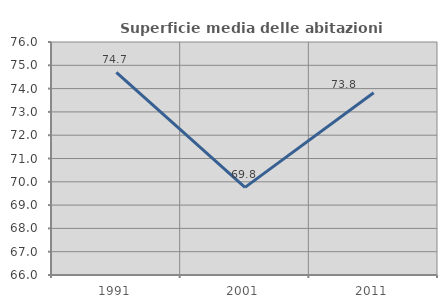
| Category | Superficie media delle abitazioni occupate |
|---|---|
| 1991.0 | 74.699 |
| 2001.0 | 69.76 |
| 2011.0 | 73.825 |